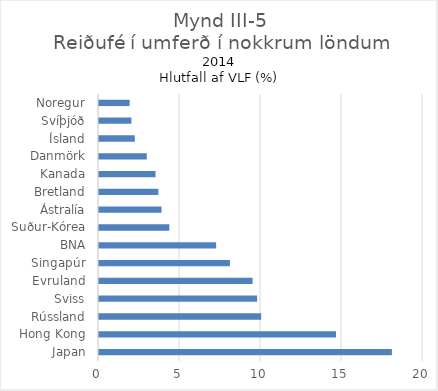
| Category | Series 0 |
|---|---|
| Japan | 18.08 |
| Hong Kong | 14.63 |
| Rússland | 10.01 |
| Sviss | 9.76 |
| Evruland | 9.48 |
| Singapúr | 8.08 |
| BNA | 7.23 |
| Suður-Kórea | 4.34 |
| Ástralía | 3.86 |
| Bretland | 3.66 |
| Kanada | 3.49 |
| Danmörk | 2.95 |
| Ísland | 2.21 |
| Svíþjóð | 2 |
| Noregur | 1.89 |